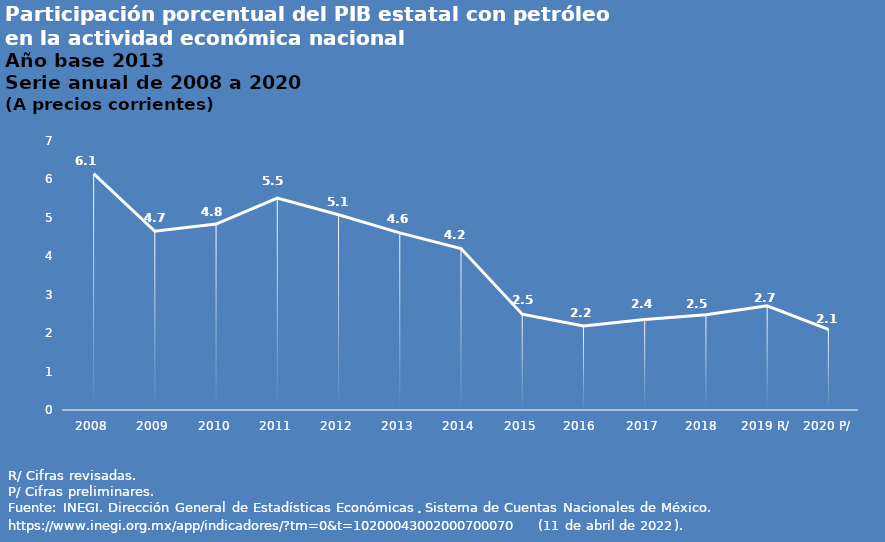
| Category | Series 0 |
|---|---|
| 2008 | 6.149 |
| 2009 | 4.652 |
| 2010 | 4.839 |
| 2011 | 5.513 |
| 2012 | 5.08 |
| 2013 | 4.61 |
| 2014 | 4.202 |
| 2015 | 2.492 |
| 2016  | 2.186 |
| 2017 | 2.357 |
| 2018  | 2.476 |
| 2019 R/ | 2.711 |
| 2020 P/ | 2.097 |